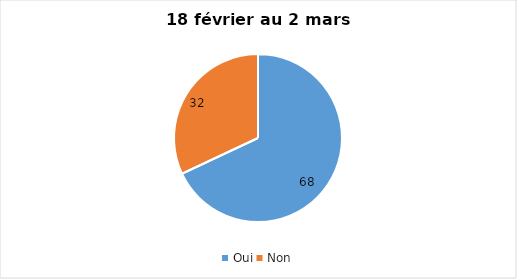
| Category | 18 février au 2 mars 2022 |
|---|---|
| Oui | 68 |
| Non | 32 |